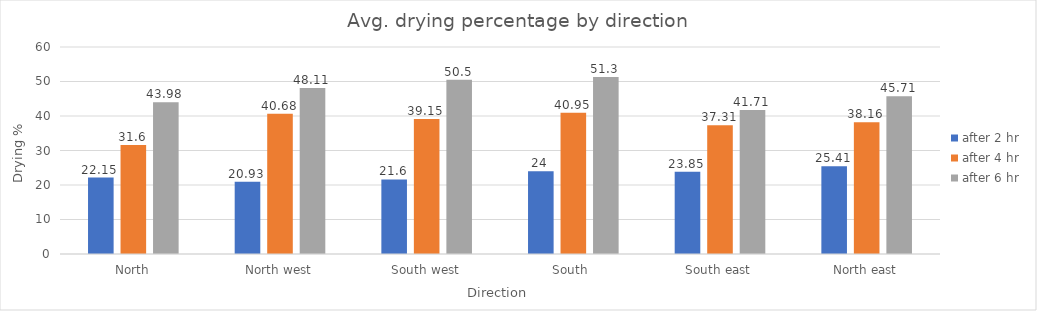
| Category | after 2 hr | after 4 hr | after 6 hr |
|---|---|---|---|
| North | 22.15 | 31.6 | 43.98 |
| North west | 20.93 | 40.68 | 48.11 |
| South west | 21.6 | 39.15 | 50.5 |
| South  | 24 | 40.95 | 51.3 |
| South east | 23.85 | 37.31 | 41.71 |
| North east | 25.41 | 38.16 | 45.71 |